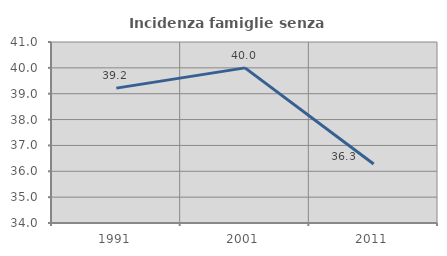
| Category | Incidenza famiglie senza nuclei |
|---|---|
| 1991.0 | 39.216 |
| 2001.0 | 40 |
| 2011.0 | 36.283 |